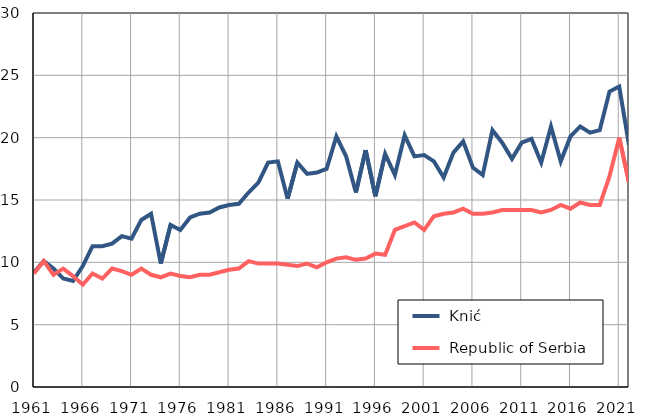
| Category |  Knić |  Republic of Serbia |
|---|---|---|
| 1961.0 | 9.2 | 9.1 |
| 1962.0 | 10.1 | 10.1 |
| 1963.0 | 9.5 | 9 |
| 1964.0 | 8.7 | 9.5 |
| 1965.0 | 8.5 | 8.9 |
| 1966.0 | 9.7 | 8.2 |
| 1967.0 | 11.3 | 9.1 |
| 1968.0 | 11.3 | 8.7 |
| 1969.0 | 11.5 | 9.5 |
| 1970.0 | 12.1 | 9.3 |
| 1971.0 | 11.9 | 9 |
| 1972.0 | 13.4 | 9.5 |
| 1973.0 | 13.9 | 9 |
| 1974.0 | 9.9 | 8.8 |
| 1975.0 | 13 | 9.1 |
| 1976.0 | 12.6 | 8.9 |
| 1977.0 | 13.6 | 8.8 |
| 1978.0 | 13.9 | 9 |
| 1979.0 | 14 | 9 |
| 1980.0 | 14.4 | 9.2 |
| 1981.0 | 14.6 | 9.4 |
| 1982.0 | 14.7 | 9.5 |
| 1983.0 | 15.6 | 10.1 |
| 1984.0 | 16.4 | 9.9 |
| 1985.0 | 18 | 9.9 |
| 1986.0 | 18.1 | 9.9 |
| 1987.0 | 15.1 | 9.8 |
| 1988.0 | 18 | 9.7 |
| 1989.0 | 17.1 | 9.9 |
| 1990.0 | 17.2 | 9.6 |
| 1991.0 | 17.5 | 10 |
| 1992.0 | 20.1 | 10.3 |
| 1993.0 | 18.5 | 10.4 |
| 1994.0 | 15.6 | 10.2 |
| 1995.0 | 19 | 10.3 |
| 1996.0 | 15.3 | 10.7 |
| 1997.0 | 18.7 | 10.6 |
| 1998.0 | 17 | 12.6 |
| 1999.0 | 20.2 | 12.9 |
| 2000.0 | 18.5 | 13.2 |
| 2001.0 | 18.6 | 12.6 |
| 2002.0 | 18.1 | 13.7 |
| 2003.0 | 16.8 | 13.9 |
| 2004.0 | 18.8 | 14 |
| 2005.0 | 19.7 | 14.3 |
| 2006.0 | 17.6 | 13.9 |
| 2007.0 | 17 | 13.9 |
| 2008.0 | 20.6 | 14 |
| 2009.0 | 19.6 | 14.2 |
| 2010.0 | 18.3 | 14.2 |
| 2011.0 | 19.6 | 14.2 |
| 2012.0 | 19.9 | 14.2 |
| 2013.0 | 18 | 14 |
| 2014.0 | 20.9 | 14.2 |
| 2015.0 | 18.1 | 14.6 |
| 2016.0 | 20.1 | 14.3 |
| 2017.0 | 20.9 | 14.8 |
| 2018.0 | 20.4 | 14.6 |
| 2019.0 | 20.6 | 14.6 |
| 2020.0 | 23.7 | 16.9 |
| 2021.0 | 24.1 | 20 |
| 2022.0 | 19.4 | 16.4 |